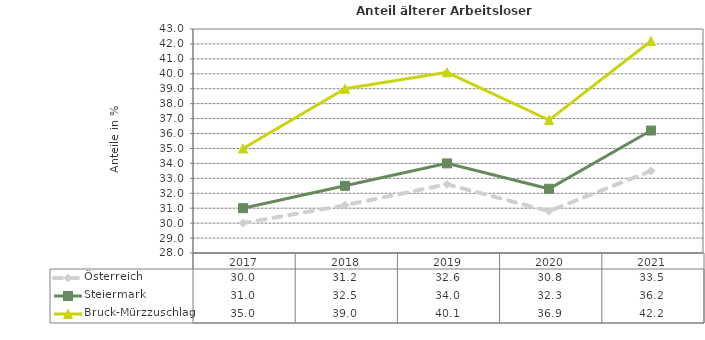
| Category | Österreich | Steiermark | Bruck-Mürzzuschlag |
|---|---|---|---|
| 2021.0 | 33.5 | 36.2 | 42.2 |
| 2020.0 | 30.8 | 32.3 | 36.9 |
| 2019.0 | 32.6 | 34 | 40.1 |
| 2018.0 | 31.2 | 32.5 | 39 |
| 2017.0 | 30 | 31 | 35 |